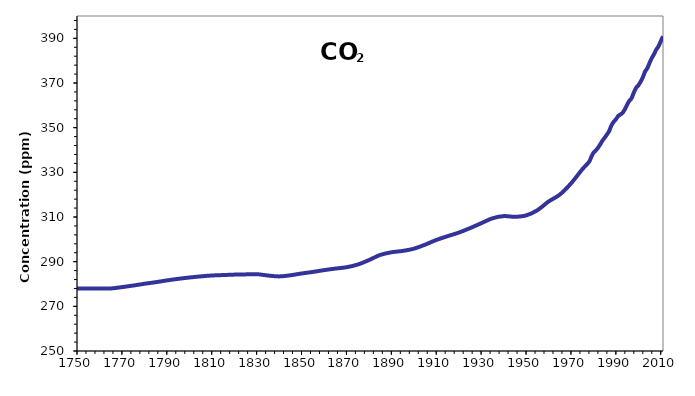
| Category | CO2 |
|---|---|
| 1750.0 | 278 |
| 1755.0 | 278 |
| 1760.0 | 278 |
| 1765.0 | 278 |
| 1770.0 | 278.6 |
| 1775.0 | 279.3 |
| 1780.0 | 280.1 |
| 1785.0 | 280.8 |
| 1790.0 | 281.6 |
| 1795.0 | 282.3 |
| 1800.0 | 282.9 |
| 1805.0 | 283.4 |
| 1810.0 | 283.8 |
| 1815.0 | 284 |
| 1820.0 | 284.2 |
| 1825.0 | 284.3 |
| 1830.0 | 284.4 |
| 1835.0 | 283.8 |
| 1840.0 | 283.4 |
| 1845.0 | 283.9 |
| 1850.0 | 284.7 |
| 1855.0 | 285.4 |
| 1860.0 | 286.2 |
| 1865.0 | 286.9 |
| 1870.0 | 287.5 |
| 1875.0 | 288.7 |
| 1880.0 | 290.7 |
| 1885.0 | 293 |
| 1890.0 | 294.2 |
| 1895.0 | 294.8 |
| 1900.0 | 295.8 |
| 1905.0 | 297.6 |
| 1910.0 | 299.7 |
| 1915.0 | 301.4 |
| 1920.0 | 303 |
| 1925.0 | 305 |
| 1930.0 | 307.2 |
| 1935.0 | 309.4 |
| 1940.0 | 310.4 |
| 1945.0 | 310.1 |
| 1950.0 | 310.7 |
| 1955.0 | 313 |
| 1960.0 | 316.9 |
| 1965.0 | 320 |
| 1970.0 | 325 |
| 1975.0 | 331.3 |
| 1978.0 | 334.6 |
| 1979.0 | 336.74 |
| 1980.0 | 338.7 |
| 1981.0 | 339.737 |
| 1982.0 | 340.92 |
| 1983.0 | 342.465 |
| 1984.0 | 344.132 |
| 1985.0 | 345.472 |
| 1986.0 | 346.885 |
| 1987.0 | 348.462 |
| 1988.0 | 350.925 |
| 1989.0 | 352.565 |
| 1990.0 | 353.72 |
| 1991.0 | 355.148 |
| 1992.0 | 355.898 |
| 1993.0 | 356.625 |
| 1994.0 | 358.2 |
| 1995.0 | 360.228 |
| 1996.0 | 362.01 |
| 1997.0 | 363.166 |
| 1998.0 | 365.688 |
| 1999.0 | 367.808 |
| 2000.0 | 368.92 |
| 2001.0 | 370.51 |
| 2002.0 | 372.493 |
| 2003.0 | 375.08 |
| 2004.0 | 376.606 |
| 2005.0 | 378.972 |
| 2006.0 | 381.168 |
| 2007.0 | 382.891 |
| 2008.0 | 384.976 |
| 2009.0 | 386.415 |
| 2010.0 | 388.706 |
| 2011.0 | 390.9 |